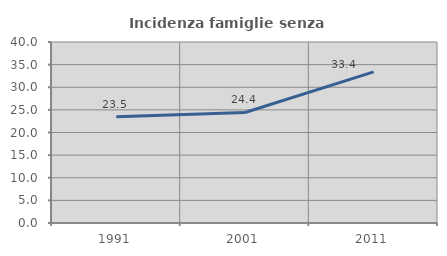
| Category | Incidenza famiglie senza nuclei |
|---|---|
| 1991.0 | 23.478 |
| 2001.0 | 24.423 |
| 2011.0 | 33.413 |